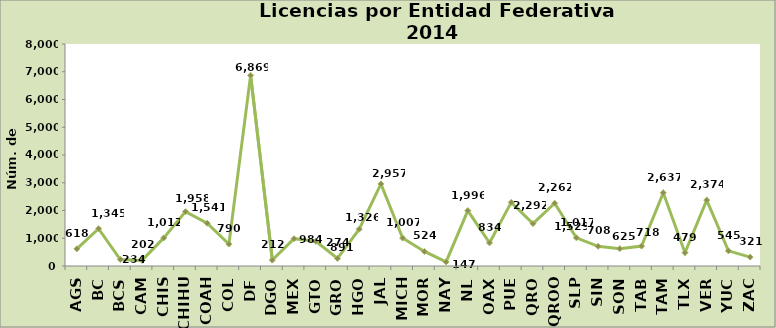
| Category | Series 0 |
|---|---|
| AGS | 618 |
| BC | 1345 |
| BCS | 234 |
| CAM | 202 |
| CHIS | 1012 |
| CHIHU | 1958 |
| COAH | 1541 |
| COL | 790 |
| DF | 6869 |
| DGO | 212 |
| MEX | 984 |
| GTO | 891 |
| GRO | 274 |
| HGO | 1326 |
| JAL | 2957 |
| MICH | 1007 |
| MOR | 524 |
| NAY | 147 |
| NL | 1996 |
| OAX | 834 |
| PUE | 2292 |
| QRO | 1529 |
| QROO | 2262 |
| SLP | 1017 |
| SIN | 708 |
| SON | 625 |
| TAB | 718 |
| TAM | 2637 |
| TLX | 479 |
| VER | 2374 |
| YUC | 545 |
| ZAC | 321 |